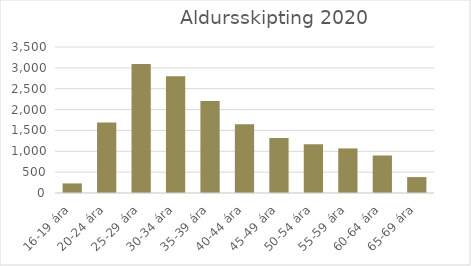
| Category | Series 0 |
|---|---|
| 16-19 ára | 229.667 |
| 20-24 ára | 1688.917 |
| 25-29 ára | 3090 |
| 30-34 ára | 2797.333 |
| 35-39 ára | 2205.5 |
| 40-44 ára | 1650.833 |
| 45-49 ára | 1318.833 |
| 50-54 ára | 1166.083 |
| 55-59 ára | 1068.583 |
| 60-64 ára | 899.167 |
| 65-69 ára | 381.417 |